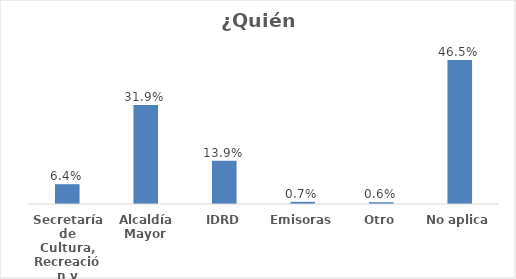
| Category | Series 0 |
|---|---|
| Secretaría de Cultura, Recreación y Deporte | 0.064 |
| Alcaldía Mayor | 0.319 |
| IDRD | 0.139 |
| Emisoras | 0.007 |
| Otro | 0.006 |
| No aplica | 0.465 |